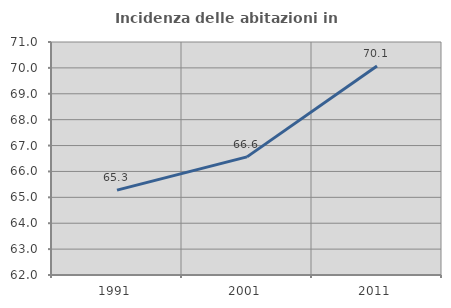
| Category | Incidenza delle abitazioni in proprietà  |
|---|---|
| 1991.0 | 65.278 |
| 2001.0 | 66.563 |
| 2011.0 | 70.072 |